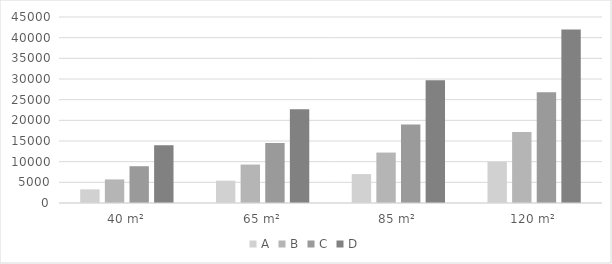
| Category | A | B | C | D |
|---|---|---|---|---|
| 40 m² | 3300 | 5700 | 8900 | 14000 |
| 65 m² | 5400 | 9300 | 14500 | 22700 |
| 85 m² | 7000 | 12200 | 19000 | 29700 |
| 120 m² | 10000 | 17200 | 26800 | 42000 |